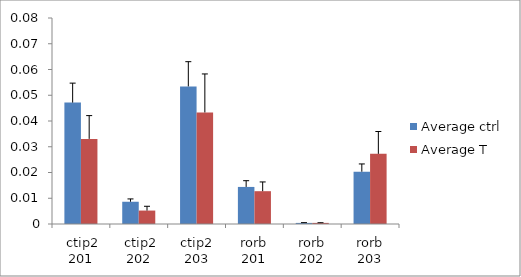
| Category | Average ctrl | Average T |
|---|---|---|
|  ctip2 201 | 0.047 | 0.033 |
|  ctip2 202 | 0.009 | 0.005 |
| ctip2 203 | 0.053 | 0.043 |
| rorb 201 | 0.014 | 0.013 |
| rorb 202 | 0 | 0 |
| rorb 203 | 0.02 | 0.027 |